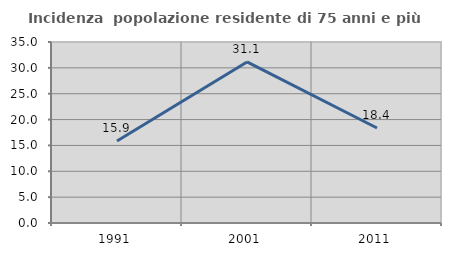
| Category | Incidenza  popolazione residente di 75 anni e più |
|---|---|
| 1991.0 | 15.854 |
| 2001.0 | 31.148 |
| 2011.0 | 18.367 |